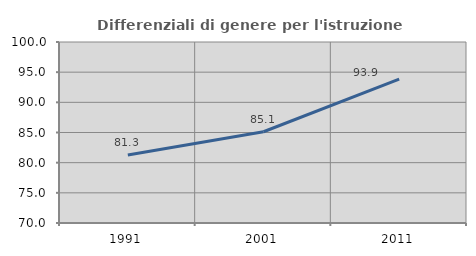
| Category | Differenziali di genere per l'istruzione superiore |
|---|---|
| 1991.0 | 81.264 |
| 2001.0 | 85.123 |
| 2011.0 | 93.856 |